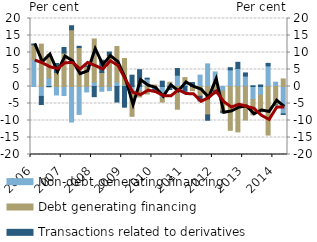
| Category | Non-debt generating financing | Debt generating financing | Transactions related to derivatives |
|---|---|---|---|
| 2006.0 | 7.935 | 4.323 | 0.253 |
| 2006.0 | -2.908 | 12.463 | -2.398 |
| 2006.0 | 2.524 | 6.95 | -0.082 |
| 2006.0 | -2.488 | 4.087 | 2.684 |
| 2007.0 | -2.662 | 9.861 | 1.606 |
| 2007.0 | -10.439 | 16.698 | 1.167 |
| 2007.0 | -8.199 | 11.452 | 0.378 |
| 2007.0 | -1.602 | 5.903 | 0.174 |
| 2008.0 | 1.306 | 12.685 | -2.99 |
| 2008.0 | -1.403 | 4.124 | 3.595 |
| 2008.0 | -1.204 | 9.091 | 1.039 |
| 2008.0 | 1.328 | 10.432 | -4.573 |
| 2009.0 | 0.559 | 7.682 | -6.088 |
| 2009.0 | -2.171 | -6.591 | 3.328 |
| 2009.0 | -1.297 | -1.78 | 4.935 |
| 2009.0 | 2.216 | -2.203 | 0.245 |
| 2010.0 | -0.763 | 0.438 | -0.115 |
| 2010.0 | -3.352 | -1.231 | 1.572 |
| 2010.0 | 0.694 | 0.56 | -0.901 |
| 2010.0 | 3.327 | -6.68 | 1.957 |
| 2011.0 | 1.104 | 1.518 | -1.43 |
| 2011.0 | -0.172 | -1.069 | 1.155 |
| 2011.0 | 3.348 | -2.863 | -1.386 |
| 2011.0 | 6.649 | -8.353 | -1.577 |
| 2012.0 | 4.277 | -1.135 | -0.975 |
| 2012.0 | -1.327 | -5.91 | -0.484 |
| 2012.0 | 4.903 | -12.879 | 0.63 |
| 2012.0 | 5.29 | -13.347 | 1.828 |
| 2013.0 | 3.066 | -9.857 | 0.927 |
| 2013.0 | -3.836 | -4.512 | 0.21 |
| 2013.0 | -2.538 | -4.959 | 0.445 |
| 2013.0 | 6.073 | -14.286 | 0.727 |
| 2014.0 | 1.279 | -5.435 | -0.022 |
| 2014.0 | -8.039 | 2.222 | -0.186 |